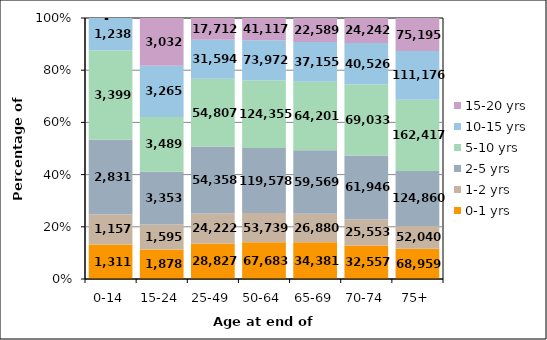
| Category | 0-1 yrs | 1-2 yrs | 2-5 yrs | 5-10 yrs | 10-15 yrs | 15-20 yrs |
|---|---|---|---|---|---|---|
| 0-14 | 1311 | 1157 | 2831 | 3399 | 1238 | 0 |
| 15-24 | 1878 | 1595 | 3353 | 3489 | 3265 | 3032 |
| 25-49 | 28827 | 24222 | 54358 | 54807 | 31594 | 17712 |
| 50-64 | 67683 | 53739 | 119578 | 124355 | 73972 | 41117 |
| 65-69 | 34381 | 26880 | 59569 | 64201 | 37155 | 22589 |
| 70-74 | 32557 | 25553 | 61946 | 69033 | 40526 | 24242 |
| 75+ | 68959 | 52040 | 124860 | 162417 | 111176 | 75195 |